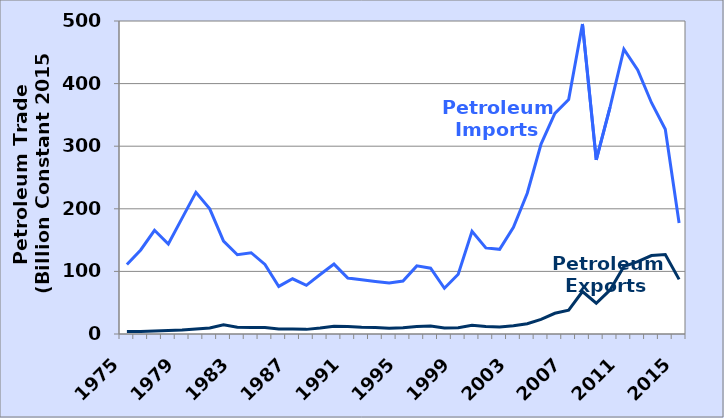
| Category | Petroleum Exports | Petroleum Imports |
|---|---|---|
| 1975.0 | 3.997 | 111.005 |
| 1976.0 | 4.157 | 134.236 |
| 1977.0 | 4.989 | 165.709 |
| 1978.0 | 5.676 | 143.687 |
| 1979.0 | 6.247 | 185.156 |
| 1980.0 | 8.15 | 226.192 |
| 1981.0 | 9.637 | 199.884 |
| 1982.0 | 14.607 | 148.493 |
| 1983.0 | 10.845 | 126.639 |
| 1984.0 | 10.196 | 129.855 |
| 1985.0 | 10.369 | 111.185 |
| 1986.0 | 7.871 | 75.997 |
| 1987.0 | 8.183 | 88.225 |
| 1988.0 | 7.398 | 77.71 |
| 1989.0 | 9.597 | 95.006 |
| 1990.0 | 12.514 | 111.677 |
| 1991.0 | 12.101 | 89.36 |
| 1992.0 | 10.832 | 86.524 |
| 1993.0 | 10.194 | 83.729 |
| 1994.0 | 9.05 | 81.301 |
| 1995.0 | 9.831 | 84.555 |
| 1996.0 | 12.061 | 108.798 |
| 1997.0 | 12.688 | 105.073 |
| 1998.0 | 9.559 | 73.088 |
| 1999.0 | 10.127 | 95.565 |
| 2000.0 | 14.028 | 164.138 |
| 2001.0 | 11.868 | 137.509 |
| 2002.0 | 11.29 | 135.258 |
| 2003.0 | 13.151 | 170.592 |
| 2004.0 | 16.475 | 224.929 |
| 2005.0 | 23.247 | 303.484 |
| 2006.0 | 33.12 | 352.368 |
| 2007.0 | 38.058 | 374.509 |
| 2008.0 | 67.917 | 495.216 |
| 2009.0 | 49.173 | 278.221 |
| 2010.0 | 70.384 | 362.469 |
| 2011.0 | 107.667 | 455.055 |
| 2012.0 | 115.57 | 421.716 |
| 2013.0 | 125.365 | 369.47 |
| 2014.0 | 127.079 | 327.103 |
| 2015.0 | 87.272 | 177.438 |